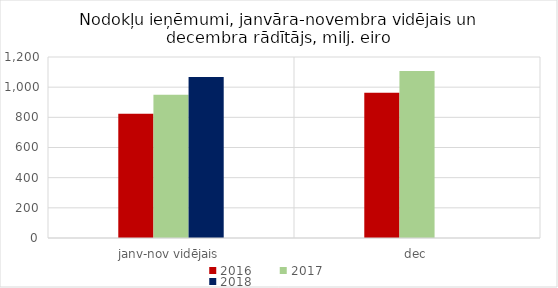
| Category | 2016 | 2017 | 2018 |
|---|---|---|---|
| janv-nov vidējais | 824369.827 | 949988.056 | 1067772.889 |
| dec | 962936.043 | 1107409.079 | 0 |